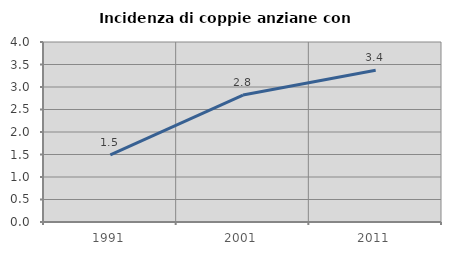
| Category | Incidenza di coppie anziane con figli |
|---|---|
| 1991.0 | 1.49 |
| 2001.0 | 2.82 |
| 2011.0 | 3.37 |